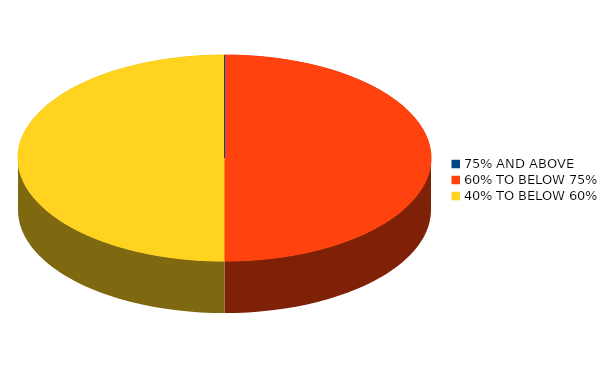
| Category | Number of students |
|---|---|
| 75% AND ABOVE | 0 |
| 60% TO BELOW 75% | 7 |
| 40% TO BELOW 60% | 7 |